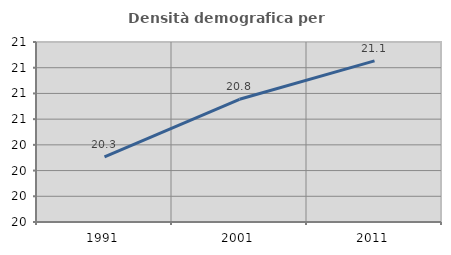
| Category | Densità demografica |
|---|---|
| 1991.0 | 20.307 |
| 2001.0 | 20.755 |
| 2011.0 | 21.053 |